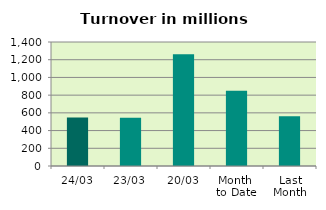
| Category | Series 0 |
|---|---|
| 24/03 | 547.002 |
| 23/03 | 544.897 |
| 20/03 | 1260.528 |
| Month 
to Date | 848.74 |
| Last
Month | 561.452 |